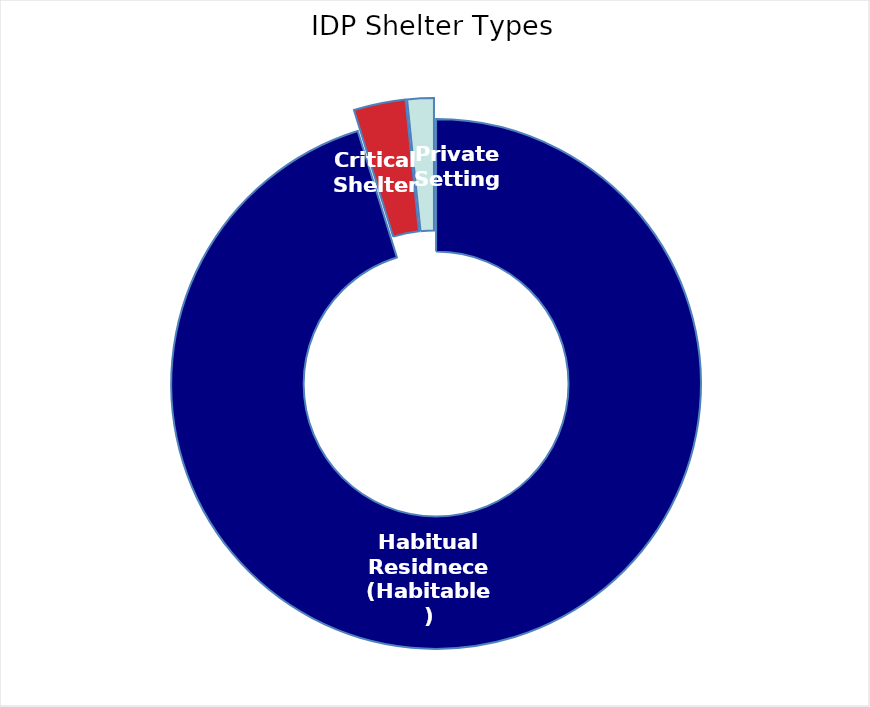
| Category | Families |
|---|---|
| Habitual Residnece (Habitable) | 707929 |
| Critical Shelter | 23509 |
| Private Setting | 12030 |